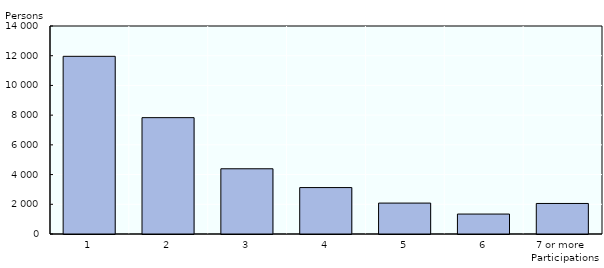
| Category | Public works |
|---|---|
| 1 | 11959 |
| 2 | 7831 |
| 3 | 4390 |
| 4 | 3125 |
| 5 | 2081 |
| 6 | 1342 |
| 7 or more | 2056 |